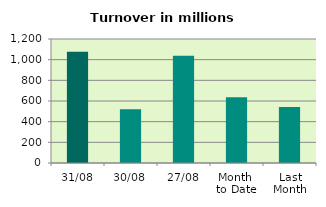
| Category | Series 0 |
|---|---|
| 31/08 | 1077.259 |
| 30/08 | 519.387 |
| 27/08 | 1036.884 |
| Month 
to Date | 635.477 |
| Last
Month | 542.77 |